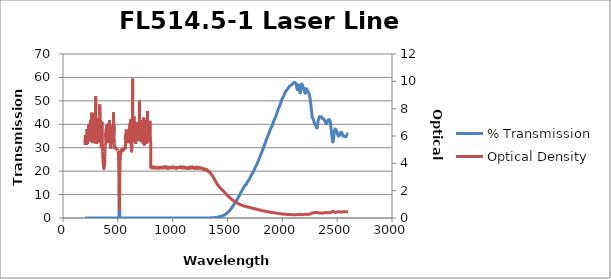
| Category | % Transmission |
|---|---|
| 2600.0 | 36.091 |
| 2599.0 | 36.079 |
| 2598.0 | 36.048 |
| 2597.0 | 36.021 |
| 2596.0 | 35.989 |
| 2595.0 | 35.951 |
| 2594.0 | 35.898 |
| 2593.0 | 35.84 |
| 2592.0 | 35.777 |
| 2591.0 | 35.707 |
| 2590.0 | 35.623 |
| 2589.0 | 35.537 |
| 2588.0 | 35.45 |
| 2587.0 | 35.343 |
| 2586.0 | 35.245 |
| 2585.0 | 35.151 |
| 2584.0 | 35.06 |
| 2583.0 | 34.962 |
| 2582.0 | 34.872 |
| 2581.0 | 34.804 |
| 2580.0 | 34.757 |
| 2579.0 | 34.724 |
| 2578.0 | 34.706 |
| 2577.0 | 34.711 |
| 2576.0 | 34.719 |
| 2575.0 | 34.741 |
| 2574.0 | 34.766 |
| 2573.0 | 34.79 |
| 2572.0 | 34.81 |
| 2571.0 | 34.83 |
| 2570.0 | 34.859 |
| 2569.0 | 34.868 |
| 2568.0 | 34.877 |
| 2567.0 | 34.877 |
| 2566.0 | 34.877 |
| 2565.0 | 34.872 |
| 2564.0 | 34.865 |
| 2563.0 | 34.86 |
| 2562.0 | 34.849 |
| 2561.0 | 34.852 |
| 2560.0 | 34.862 |
| 2559.0 | 34.874 |
| 2558.0 | 34.892 |
| 2557.0 | 34.929 |
| 2556.0 | 34.962 |
| 2555.0 | 35.015 |
| 2554.0 | 35.087 |
| 2553.0 | 35.17 |
| 2552.0 | 35.279 |
| 2551.0 | 35.398 |
| 2550.0 | 35.527 |
| 2549.0 | 35.647 |
| 2548.0 | 35.785 |
| 2547.0 | 35.908 |
| 2546.0 | 36.027 |
| 2545.0 | 36.131 |
| 2544.0 | 36.241 |
| 2543.0 | 36.333 |
| 2542.0 | 36.409 |
| 2541.0 | 36.477 |
| 2540.0 | 36.534 |
| 2539.0 | 36.573 |
| 2538.0 | 36.598 |
| 2537.0 | 36.615 |
| 2536.0 | 36.607 |
| 2535.0 | 36.579 |
| 2534.0 | 36.534 |
| 2533.0 | 36.465 |
| 2532.0 | 36.389 |
| 2531.0 | 36.3 |
| 2530.0 | 36.211 |
| 2529.0 | 36.112 |
| 2528.0 | 36.014 |
| 2527.0 | 35.909 |
| 2526.0 | 35.806 |
| 2525.0 | 35.697 |
| 2524.0 | 35.588 |
| 2523.0 | 35.485 |
| 2522.0 | 35.38 |
| 2521.0 | 35.276 |
| 2520.0 | 35.186 |
| 2519.0 | 35.105 |
| 2518.0 | 35.038 |
| 2517.0 | 34.98 |
| 2516.0 | 34.938 |
| 2515.0 | 34.918 |
| 2514.0 | 34.913 |
| 2513.0 | 34.931 |
| 2512.0 | 34.965 |
| 2511.0 | 35.035 |
| 2510.0 | 35.107 |
| 2509.0 | 35.21 |
| 2508.0 | 35.31 |
| 2507.0 | 35.444 |
| 2506.0 | 35.559 |
| 2505.0 | 35.707 |
| 2504.0 | 35.849 |
| 2503.0 | 36.005 |
| 2502.0 | 36.158 |
| 2501.0 | 36.313 |
| 2500.0 | 36.443 |
| 2499.0 | 36.578 |
| 2498.0 | 36.703 |
| 2497.0 | 36.817 |
| 2496.0 | 36.941 |
| 2495.0 | 37.043 |
| 2494.0 | 37.14 |
| 2493.0 | 37.218 |
| 2492.0 | 37.312 |
| 2491.0 | 37.381 |
| 2490.0 | 37.481 |
| 2489.0 | 37.564 |
| 2488.0 | 37.668 |
| 2487.0 | 37.744 |
| 2486.0 | 37.837 |
| 2485.0 | 37.895 |
| 2484.0 | 37.964 |
| 2483.0 | 37.991 |
| 2482.0 | 38.01 |
| 2481.0 | 37.971 |
| 2480.0 | 37.9 |
| 2479.0 | 37.768 |
| 2478.0 | 37.606 |
| 2477.0 | 37.393 |
| 2476.0 | 37.152 |
| 2475.0 | 36.886 |
| 2474.0 | 36.596 |
| 2473.0 | 36.276 |
| 2472.0 | 35.916 |
| 2471.0 | 35.552 |
| 2470.0 | 35.146 |
| 2469.0 | 34.742 |
| 2468.0 | 34.334 |
| 2467.0 | 33.932 |
| 2466.0 | 33.528 |
| 2465.0 | 33.167 |
| 2464.0 | 32.846 |
| 2463.0 | 32.61 |
| 2462.0 | 32.454 |
| 2461.0 | 32.417 |
| 2460.0 | 32.459 |
| 2459.0 | 32.606 |
| 2458.0 | 32.813 |
| 2457.0 | 33.111 |
| 2456.0 | 33.435 |
| 2455.0 | 33.795 |
| 2454.0 | 34.15 |
| 2453.0 | 34.538 |
| 2452.0 | 34.908 |
| 2451.0 | 35.316 |
| 2450.0 | 35.735 |
| 2449.0 | 36.171 |
| 2448.0 | 36.601 |
| 2447.0 | 37.065 |
| 2446.0 | 37.528 |
| 2445.0 | 37.983 |
| 2444.0 | 38.453 |
| 2443.0 | 38.918 |
| 2442.0 | 39.324 |
| 2441.0 | 39.74 |
| 2440.0 | 40.087 |
| 2439.0 | 40.405 |
| 2438.0 | 40.683 |
| 2437.0 | 40.929 |
| 2436.0 | 41.141 |
| 2435.0 | 41.329 |
| 2434.0 | 41.485 |
| 2433.0 | 41.613 |
| 2432.0 | 41.71 |
| 2431.0 | 41.797 |
| 2430.0 | 41.868 |
| 2429.0 | 41.919 |
| 2428.0 | 41.97 |
| 2427.0 | 42.006 |
| 2426.0 | 42.016 |
| 2425.0 | 42.021 |
| 2424.0 | 42.012 |
| 2423.0 | 41.988 |
| 2422.0 | 41.972 |
| 2421.0 | 41.943 |
| 2420.0 | 41.904 |
| 2419.0 | 41.867 |
| 2418.0 | 41.816 |
| 2417.0 | 41.762 |
| 2416.0 | 41.711 |
| 2415.0 | 41.638 |
| 2414.0 | 41.557 |
| 2413.0 | 41.453 |
| 2412.0 | 41.32 |
| 2411.0 | 41.185 |
| 2410.0 | 41.03 |
| 2409.0 | 40.877 |
| 2408.0 | 40.726 |
| 2407.0 | 40.561 |
| 2406.0 | 40.422 |
| 2405.0 | 40.295 |
| 2404.0 | 40.21 |
| 2403.0 | 40.172 |
| 2402.0 | 40.163 |
| 2401.0 | 40.191 |
| 2400.0 | 40.245 |
| 2399.0 | 40.315 |
| 2398.0 | 40.412 |
| 2397.0 | 40.516 |
| 2396.0 | 40.627 |
| 2395.0 | 40.742 |
| 2394.0 | 40.836 |
| 2393.0 | 40.927 |
| 2392.0 | 41.01 |
| 2391.0 | 41.091 |
| 2390.0 | 41.18 |
| 2389.0 | 41.274 |
| 2388.0 | 41.371 |
| 2387.0 | 41.47 |
| 2386.0 | 41.568 |
| 2385.0 | 41.671 |
| 2384.0 | 41.78 |
| 2383.0 | 41.88 |
| 2382.0 | 41.986 |
| 2381.0 | 42.065 |
| 2380.0 | 42.14 |
| 2379.0 | 42.179 |
| 2378.0 | 42.216 |
| 2377.0 | 42.239 |
| 2376.0 | 42.26 |
| 2375.0 | 42.256 |
| 2374.0 | 42.267 |
| 2373.0 | 42.26 |
| 2372.0 | 42.273 |
| 2371.0 | 42.292 |
| 2370.0 | 42.325 |
| 2369.0 | 42.355 |
| 2368.0 | 42.387 |
| 2367.0 | 42.423 |
| 2366.0 | 42.463 |
| 2365.0 | 42.515 |
| 2364.0 | 42.586 |
| 2363.0 | 42.676 |
| 2362.0 | 42.759 |
| 2361.0 | 42.865 |
| 2360.0 | 42.955 |
| 2359.0 | 43.054 |
| 2358.0 | 43.118 |
| 2357.0 | 43.179 |
| 2356.0 | 43.194 |
| 2355.0 | 43.185 |
| 2354.0 | 43.148 |
| 2353.0 | 43.115 |
| 2352.0 | 43.083 |
| 2351.0 | 43.065 |
| 2350.0 | 43.061 |
| 2349.0 | 43.061 |
| 2348.0 | 43.083 |
| 2347.0 | 43.108 |
| 2346.0 | 43.162 |
| 2345.0 | 43.199 |
| 2344.0 | 43.254 |
| 2343.0 | 43.274 |
| 2342.0 | 43.3 |
| 2341.0 | 43.302 |
| 2340.0 | 43.298 |
| 2339.0 | 43.269 |
| 2338.0 | 43.233 |
| 2337.0 | 43.164 |
| 2336.0 | 43.056 |
| 2335.0 | 42.937 |
| 2334.0 | 42.787 |
| 2333.0 | 42.63 |
| 2332.0 | 42.464 |
| 2331.0 | 42.284 |
| 2330.0 | 42.091 |
| 2329.0 | 41.901 |
| 2328.0 | 41.706 |
| 2327.0 | 41.502 |
| 2326.0 | 41.304 |
| 2325.0 | 41.069 |
| 2324.0 | 40.822 |
| 2323.0 | 40.53 |
| 2322.0 | 40.216 |
| 2321.0 | 39.869 |
| 2320.0 | 39.519 |
| 2319.0 | 39.188 |
| 2318.0 | 38.885 |
| 2317.0 | 38.649 |
| 2316.0 | 38.492 |
| 2315.0 | 38.417 |
| 2314.0 | 38.424 |
| 2313.0 | 38.493 |
| 2312.0 | 38.615 |
| 2311.0 | 38.76 |
| 2310.0 | 38.921 |
| 2309.0 | 39.086 |
| 2308.0 | 39.223 |
| 2307.0 | 39.33 |
| 2306.0 | 39.399 |
| 2305.0 | 39.437 |
| 2304.0 | 39.466 |
| 2303.0 | 39.474 |
| 2302.0 | 39.503 |
| 2301.0 | 39.528 |
| 2300.0 | 39.575 |
| 2299.0 | 39.643 |
| 2298.0 | 39.73 |
| 2297.0 | 39.842 |
| 2296.0 | 39.966 |
| 2295.0 | 40.107 |
| 2294.0 | 40.239 |
| 2293.0 | 40.381 |
| 2292.0 | 40.527 |
| 2291.0 | 40.676 |
| 2290.0 | 40.829 |
| 2289.0 | 40.997 |
| 2288.0 | 41.159 |
| 2287.0 | 41.332 |
| 2286.0 | 41.512 |
| 2285.0 | 41.701 |
| 2284.0 | 41.875 |
| 2283.0 | 42.059 |
| 2282.0 | 42.215 |
| 2281.0 | 42.345 |
| 2280.0 | 42.449 |
| 2279.0 | 42.53 |
| 2278.0 | 42.585 |
| 2277.0 | 42.637 |
| 2276.0 | 42.693 |
| 2275.0 | 42.764 |
| 2274.0 | 42.877 |
| 2273.0 | 43.035 |
| 2272.0 | 43.256 |
| 2271.0 | 43.534 |
| 2270.0 | 43.887 |
| 2269.0 | 44.289 |
| 2268.0 | 44.718 |
| 2267.0 | 45.177 |
| 2266.0 | 45.638 |
| 2265.0 | 46.106 |
| 2264.0 | 46.583 |
| 2263.0 | 47.058 |
| 2262.0 | 47.505 |
| 2261.0 | 47.934 |
| 2260.0 | 48.348 |
| 2259.0 | 48.748 |
| 2258.0 | 49.131 |
| 2257.0 | 49.519 |
| 2256.0 | 49.892 |
| 2255.0 | 50.237 |
| 2254.0 | 50.582 |
| 2253.0 | 50.913 |
| 2252.0 | 51.219 |
| 2251.0 | 51.524 |
| 2250.0 | 51.81 |
| 2249.0 | 52.063 |
| 2248.0 | 52.303 |
| 2247.0 | 52.523 |
| 2246.0 | 52.723 |
| 2245.0 | 52.898 |
| 2244.0 | 53.063 |
| 2243.0 | 53.199 |
| 2242.0 | 53.315 |
| 2241.0 | 53.422 |
| 2240.0 | 53.502 |
| 2239.0 | 53.577 |
| 2238.0 | 53.64 |
| 2237.0 | 53.698 |
| 2236.0 | 53.742 |
| 2235.0 | 53.798 |
| 2234.0 | 53.856 |
| 2233.0 | 53.924 |
| 2232.0 | 54.011 |
| 2231.0 | 54.115 |
| 2230.0 | 54.234 |
| 2229.0 | 54.363 |
| 2228.0 | 54.511 |
| 2227.0 | 54.658 |
| 2226.0 | 54.802 |
| 2225.0 | 54.93 |
| 2224.0 | 55.044 |
| 2223.0 | 55.128 |
| 2222.0 | 55.176 |
| 2221.0 | 55.194 |
| 2220.0 | 55.166 |
| 2219.0 | 55.093 |
| 2218.0 | 54.97 |
| 2217.0 | 54.815 |
| 2216.0 | 54.624 |
| 2215.0 | 54.401 |
| 2214.0 | 54.164 |
| 2213.0 | 53.927 |
| 2212.0 | 53.7 |
| 2211.0 | 53.5 |
| 2210.0 | 53.351 |
| 2209.0 | 53.248 |
| 2208.0 | 53.196 |
| 2207.0 | 53.215 |
| 2206.0 | 53.288 |
| 2205.0 | 53.41 |
| 2204.0 | 53.585 |
| 2203.0 | 53.786 |
| 2202.0 | 54.01 |
| 2201.0 | 54.25 |
| 2200.0 | 54.483 |
| 2199.0 | 54.725 |
| 2198.0 | 54.937 |
| 2197.0 | 55.119 |
| 2196.0 | 55.278 |
| 2195.0 | 55.421 |
| 2194.0 | 55.525 |
| 2193.0 | 55.619 |
| 2192.0 | 55.7 |
| 2191.0 | 55.774 |
| 2190.0 | 55.859 |
| 2189.0 | 55.949 |
| 2188.0 | 56.062 |
| 2187.0 | 56.19 |
| 2186.0 | 56.331 |
| 2185.0 | 56.493 |
| 2184.0 | 56.641 |
| 2183.0 | 56.79 |
| 2182.0 | 56.924 |
| 2181.0 | 57.031 |
| 2180.0 | 57.125 |
| 2179.0 | 57.19 |
| 2178.0 | 57.221 |
| 2177.0 | 57.214 |
| 2176.0 | 57.158 |
| 2175.0 | 57.065 |
| 2174.0 | 56.913 |
| 2173.0 | 56.692 |
| 2172.0 | 56.413 |
| 2171.0 | 56.07 |
| 2170.0 | 55.672 |
| 2169.0 | 55.222 |
| 2168.0 | 54.783 |
| 2167.0 | 54.336 |
| 2166.0 | 53.944 |
| 2165.0 | 53.657 |
| 2164.0 | 53.461 |
| 2163.0 | 53.39 |
| 2162.0 | 53.429 |
| 2161.0 | 53.594 |
| 2160.0 | 53.838 |
| 2159.0 | 54.149 |
| 2158.0 | 54.497 |
| 2157.0 | 54.869 |
| 2156.0 | 55.235 |
| 2155.0 | 55.586 |
| 2154.0 | 55.912 |
| 2153.0 | 56.185 |
| 2152.0 | 56.406 |
| 2151.0 | 56.579 |
| 2150.0 | 56.701 |
| 2149.0 | 56.767 |
| 2148.0 | 56.779 |
| 2147.0 | 56.745 |
| 2146.0 | 56.653 |
| 2145.0 | 56.519 |
| 2144.0 | 56.347 |
| 2143.0 | 56.13 |
| 2142.0 | 55.902 |
| 2141.0 | 55.641 |
| 2140.0 | 55.391 |
| 2139.0 | 55.172 |
| 2138.0 | 54.985 |
| 2137.0 | 54.864 |
| 2136.0 | 54.811 |
| 2135.0 | 54.872 |
| 2134.0 | 55.01 |
| 2133.0 | 55.235 |
| 2132.0 | 55.513 |
| 2131.0 | 55.845 |
| 2130.0 | 56.17 |
| 2129.0 | 56.489 |
| 2128.0 | 56.783 |
| 2127.0 | 57.019 |
| 2126.0 | 57.202 |
| 2125.0 | 57.342 |
| 2124.0 | 57.447 |
| 2123.0 | 57.52 |
| 2122.0 | 57.574 |
| 2121.0 | 57.618 |
| 2120.0 | 57.65 |
| 2119.0 | 57.694 |
| 2118.0 | 57.725 |
| 2117.0 | 57.752 |
| 2116.0 | 57.785 |
| 2115.0 | 57.805 |
| 2114.0 | 57.821 |
| 2113.0 | 57.826 |
| 2112.0 | 57.825 |
| 2111.0 | 57.823 |
| 2110.0 | 57.812 |
| 2109.0 | 57.809 |
| 2108.0 | 57.798 |
| 2107.0 | 57.781 |
| 2106.0 | 57.765 |
| 2105.0 | 57.746 |
| 2104.0 | 57.716 |
| 2103.0 | 57.685 |
| 2102.0 | 57.652 |
| 2101.0 | 57.613 |
| 2100.0 | 57.566 |
| 2099.0 | 57.524 |
| 2098.0 | 57.477 |
| 2097.0 | 57.432 |
| 2096.0 | 57.381 |
| 2095.0 | 57.331 |
| 2094.0 | 57.284 |
| 2093.0 | 57.235 |
| 2092.0 | 57.182 |
| 2091.0 | 57.136 |
| 2090.0 | 57.089 |
| 2089.0 | 57.041 |
| 2088.0 | 56.995 |
| 2087.0 | 56.958 |
| 2086.0 | 56.911 |
| 2085.0 | 56.88 |
| 2084.0 | 56.836 |
| 2083.0 | 56.794 |
| 2082.0 | 56.766 |
| 2081.0 | 56.73 |
| 2080.0 | 56.702 |
| 2079.0 | 56.672 |
| 2078.0 | 56.647 |
| 2077.0 | 56.617 |
| 2076.0 | 56.587 |
| 2075.0 | 56.559 |
| 2074.0 | 56.526 |
| 2073.0 | 56.498 |
| 2072.0 | 56.461 |
| 2071.0 | 56.432 |
| 2070.0 | 56.393 |
| 2069.0 | 56.352 |
| 2068.0 | 56.316 |
| 2067.0 | 56.261 |
| 2066.0 | 56.216 |
| 2065.0 | 56.164 |
| 2064.0 | 56.103 |
| 2063.0 | 56.051 |
| 2062.0 | 55.994 |
| 2061.0 | 55.927 |
| 2060.0 | 55.865 |
| 2059.0 | 55.798 |
| 2058.0 | 55.728 |
| 2057.0 | 55.658 |
| 2056.0 | 55.591 |
| 2055.0 | 55.517 |
| 2054.0 | 55.451 |
| 2053.0 | 55.377 |
| 2052.0 | 55.312 |
| 2051.0 | 55.245 |
| 2050.0 | 55.175 |
| 2049.0 | 55.121 |
| 2048.0 | 55.059 |
| 2047.0 | 54.993 |
| 2046.0 | 54.937 |
| 2045.0 | 54.875 |
| 2044.0 | 54.815 |
| 2043.0 | 54.763 |
| 2042.0 | 54.706 |
| 2041.0 | 54.646 |
| 2040.0 | 54.587 |
| 2039.0 | 54.535 |
| 2038.0 | 54.478 |
| 2037.0 | 54.426 |
| 2036.0 | 54.365 |
| 2035.0 | 54.297 |
| 2034.0 | 54.231 |
| 2033.0 | 54.169 |
| 2032.0 | 54.091 |
| 2031.0 | 54.007 |
| 2030.0 | 53.92 |
| 2029.0 | 53.833 |
| 2028.0 | 53.739 |
| 2027.0 | 53.637 |
| 2026.0 | 53.548 |
| 2025.0 | 53.44 |
| 2024.0 | 53.335 |
| 2023.0 | 53.234 |
| 2022.0 | 53.132 |
| 2021.0 | 53.021 |
| 2020.0 | 52.914 |
| 2019.0 | 52.803 |
| 2018.0 | 52.698 |
| 2017.0 | 52.593 |
| 2016.0 | 52.487 |
| 2015.0 | 52.388 |
| 2014.0 | 52.289 |
| 2013.0 | 52.182 |
| 2012.0 | 52.09 |
| 2011.0 | 51.996 |
| 2010.0 | 51.9 |
| 2009.0 | 51.814 |
| 2008.0 | 51.726 |
| 2007.0 | 51.647 |
| 2006.0 | 51.559 |
| 2005.0 | 51.465 |
| 2004.0 | 51.392 |
| 2003.0 | 51.299 |
| 2002.0 | 51.211 |
| 2001.0 | 51.118 |
| 2000.0 | 51.027 |
| 1999.0 | 50.921 |
| 1998.0 | 50.821 |
| 1997.0 | 50.716 |
| 1996.0 | 50.604 |
| 1995.0 | 50.491 |
| 1994.0 | 50.37 |
| 1993.0 | 50.24 |
| 1992.0 | 50.116 |
| 1991.0 | 49.986 |
| 1990.0 | 49.853 |
| 1989.0 | 49.716 |
| 1988.0 | 49.574 |
| 1987.0 | 49.432 |
| 1986.0 | 49.279 |
| 1985.0 | 49.141 |
| 1984.0 | 48.994 |
| 1983.0 | 48.846 |
| 1982.0 | 48.709 |
| 1981.0 | 48.572 |
| 1980.0 | 48.432 |
| 1979.0 | 48.292 |
| 1978.0 | 48.157 |
| 1977.0 | 48.041 |
| 1976.0 | 47.915 |
| 1975.0 | 47.791 |
| 1974.0 | 47.671 |
| 1973.0 | 47.555 |
| 1972.0 | 47.453 |
| 1971.0 | 47.339 |
| 1970.0 | 47.234 |
| 1969.0 | 47.139 |
| 1968.0 | 47.035 |
| 1967.0 | 46.921 |
| 1966.0 | 46.812 |
| 1965.0 | 46.705 |
| 1964.0 | 46.604 |
| 1963.0 | 46.487 |
| 1962.0 | 46.372 |
| 1961.0 | 46.241 |
| 1960.0 | 46.119 |
| 1959.0 | 46.002 |
| 1958.0 | 45.867 |
| 1957.0 | 45.728 |
| 1956.0 | 45.594 |
| 1955.0 | 45.452 |
| 1954.0 | 45.304 |
| 1953.0 | 45.147 |
| 1952.0 | 45.002 |
| 1951.0 | 44.858 |
| 1950.0 | 44.711 |
| 1949.0 | 44.555 |
| 1948.0 | 44.405 |
| 1947.0 | 44.265 |
| 1946.0 | 44.126 |
| 1945.0 | 43.986 |
| 1944.0 | 43.843 |
| 1943.0 | 43.721 |
| 1942.0 | 43.592 |
| 1941.0 | 43.468 |
| 1940.0 | 43.347 |
| 1939.0 | 43.229 |
| 1938.0 | 43.125 |
| 1937.0 | 43.02 |
| 1936.0 | 42.914 |
| 1935.0 | 42.811 |
| 1934.0 | 42.71 |
| 1933.0 | 42.621 |
| 1932.0 | 42.52 |
| 1931.0 | 42.413 |
| 1930.0 | 42.307 |
| 1929.0 | 42.198 |
| 1928.0 | 42.087 |
| 1927.0 | 41.97 |
| 1926.0 | 41.857 |
| 1925.0 | 41.741 |
| 1924.0 | 41.631 |
| 1923.0 | 41.506 |
| 1922.0 | 41.381 |
| 1921.0 | 41.243 |
| 1920.0 | 41.098 |
| 1919.0 | 40.951 |
| 1918.0 | 40.823 |
| 1917.0 | 40.7 |
| 1916.0 | 40.566 |
| 1915.0 | 40.414 |
| 1914.0 | 40.289 |
| 1913.0 | 40.143 |
| 1912.0 | 40.019 |
| 1911.0 | 39.882 |
| 1910.0 | 39.755 |
| 1909.0 | 39.645 |
| 1908.0 | 39.551 |
| 1907.0 | 39.454 |
| 1906.0 | 39.342 |
| 1905.0 | 39.231 |
| 1904.0 | 39.128 |
| 1903.0 | 39.034 |
| 1902.0 | 38.951 |
| 1901.0 | 38.863 |
| 1900.0 | 38.773 |
| 1899.0 | 38.67 |
| 1898.0 | 38.574 |
| 1897.0 | 38.48 |
| 1896.0 | 38.394 |
| 1895.0 | 38.305 |
| 1894.0 | 38.201 |
| 1893.0 | 38.097 |
| 1892.0 | 37.995 |
| 1891.0 | 37.879 |
| 1890.0 | 37.744 |
| 1889.0 | 37.62 |
| 1888.0 | 37.504 |
| 1887.0 | 37.392 |
| 1886.0 | 37.266 |
| 1885.0 | 37.135 |
| 1884.0 | 36.986 |
| 1883.0 | 36.846 |
| 1882.0 | 36.712 |
| 1881.0 | 36.593 |
| 1880.0 | 36.46 |
| 1879.0 | 36.334 |
| 1878.0 | 36.2 |
| 1877.0 | 36.064 |
| 1876.0 | 35.949 |
| 1875.0 | 35.838 |
| 1874.0 | 35.725 |
| 1873.0 | 35.614 |
| 1872.0 | 35.49 |
| 1871.0 | 35.362 |
| 1870.0 | 35.255 |
| 1869.0 | 35.156 |
| 1868.0 | 35.051 |
| 1867.0 | 34.944 |
| 1866.0 | 34.842 |
| 1865.0 | 34.729 |
| 1864.0 | 34.626 |
| 1863.0 | 34.514 |
| 1862.0 | 34.413 |
| 1861.0 | 34.307 |
| 1860.0 | 34.187 |
| 1859.0 | 34.051 |
| 1858.0 | 33.911 |
| 1857.0 | 33.783 |
| 1856.0 | 33.651 |
| 1855.0 | 33.525 |
| 1854.0 | 33.395 |
| 1853.0 | 33.254 |
| 1852.0 | 33.104 |
| 1851.0 | 32.961 |
| 1850.0 | 32.841 |
| 1849.0 | 32.709 |
| 1848.0 | 32.571 |
| 1847.0 | 32.417 |
| 1846.0 | 32.259 |
| 1845.0 | 32.134 |
| 1844.0 | 32.013 |
| 1843.0 | 31.9 |
| 1842.0 | 31.771 |
| 1841.0 | 31.64 |
| 1840.0 | 31.52 |
| 1839.0 | 31.413 |
| 1838.0 | 31.294 |
| 1837.0 | 31.179 |
| 1836.0 | 31.049 |
| 1835.0 | 30.916 |
| 1834.0 | 30.794 |
| 1833.0 | 30.68 |
| 1832.0 | 30.567 |
| 1831.0 | 30.45 |
| 1830.0 | 30.327 |
| 1829.0 | 30.196 |
| 1828.0 | 30.087 |
| 1827.0 | 29.964 |
| 1826.0 | 29.838 |
| 1825.0 | 29.703 |
| 1824.0 | 29.579 |
| 1823.0 | 29.464 |
| 1822.0 | 29.339 |
| 1821.0 | 29.212 |
| 1820.0 | 29.064 |
| 1819.0 | 28.931 |
| 1818.0 | 28.801 |
| 1817.0 | 28.681 |
| 1816.0 | 28.545 |
| 1815.0 | 28.408 |
| 1814.0 | 28.286 |
| 1813.0 | 28.157 |
| 1812.0 | 28.042 |
| 1811.0 | 27.908 |
| 1810.0 | 27.792 |
| 1809.0 | 27.682 |
| 1808.0 | 27.572 |
| 1807.0 | 27.458 |
| 1806.0 | 27.341 |
| 1805.0 | 27.242 |
| 1804.0 | 27.123 |
| 1803.0 | 27.023 |
| 1802.0 | 26.91 |
| 1801.0 | 26.801 |
| 1800.0 | 26.682 |
| 1799.0 | 26.575 |
| 1798.0 | 26.469 |
| 1797.0 | 26.352 |
| 1796.0 | 26.243 |
| 1795.0 | 26.122 |
| 1794.0 | 25.998 |
| 1793.0 | 25.876 |
| 1792.0 | 25.758 |
| 1791.0 | 25.635 |
| 1790.0 | 25.508 |
| 1789.0 | 25.384 |
| 1788.0 | 25.259 |
| 1787.0 | 25.131 |
| 1786.0 | 25.006 |
| 1785.0 | 24.881 |
| 1784.0 | 24.769 |
| 1783.0 | 24.641 |
| 1782.0 | 24.523 |
| 1781.0 | 24.401 |
| 1780.0 | 24.285 |
| 1779.0 | 24.171 |
| 1778.0 | 24.046 |
| 1777.0 | 23.933 |
| 1776.0 | 23.814 |
| 1775.0 | 23.695 |
| 1774.0 | 23.582 |
| 1773.0 | 23.466 |
| 1772.0 | 23.356 |
| 1771.0 | 23.247 |
| 1770.0 | 23.149 |
| 1769.0 | 23.044 |
| 1768.0 | 22.945 |
| 1767.0 | 22.856 |
| 1766.0 | 22.77 |
| 1765.0 | 22.679 |
| 1764.0 | 22.588 |
| 1763.0 | 22.503 |
| 1762.0 | 22.408 |
| 1761.0 | 22.317 |
| 1760.0 | 22.229 |
| 1759.0 | 22.137 |
| 1758.0 | 22.042 |
| 1757.0 | 21.95 |
| 1756.0 | 21.855 |
| 1755.0 | 21.753 |
| 1754.0 | 21.656 |
| 1753.0 | 21.553 |
| 1752.0 | 21.45 |
| 1751.0 | 21.357 |
| 1750.0 | 21.251 |
| 1749.0 | 21.147 |
| 1748.0 | 21.046 |
| 1747.0 | 20.943 |
| 1746.0 | 20.836 |
| 1745.0 | 20.723 |
| 1744.0 | 20.613 |
| 1743.0 | 20.495 |
| 1742.0 | 20.376 |
| 1741.0 | 20.268 |
| 1740.0 | 20.158 |
| 1739.0 | 20.055 |
| 1738.0 | 19.959 |
| 1737.0 | 19.858 |
| 1736.0 | 19.764 |
| 1735.0 | 19.68 |
| 1734.0 | 19.59 |
| 1733.0 | 19.511 |
| 1732.0 | 19.43 |
| 1731.0 | 19.353 |
| 1730.0 | 19.277 |
| 1729.0 | 19.2 |
| 1728.0 | 19.124 |
| 1727.0 | 19.037 |
| 1726.0 | 18.953 |
| 1725.0 | 18.868 |
| 1724.0 | 18.777 |
| 1723.0 | 18.687 |
| 1722.0 | 18.61 |
| 1721.0 | 18.53 |
| 1720.0 | 18.457 |
| 1719.0 | 18.384 |
| 1718.0 | 18.317 |
| 1717.0 | 18.243 |
| 1716.0 | 18.173 |
| 1715.0 | 18.105 |
| 1714.0 | 18.025 |
| 1713.0 | 17.944 |
| 1712.0 | 17.858 |
| 1711.0 | 17.763 |
| 1710.0 | 17.661 |
| 1709.0 | 17.565 |
| 1708.0 | 17.457 |
| 1707.0 | 17.348 |
| 1706.0 | 17.242 |
| 1705.0 | 17.116 |
| 1704.0 | 16.997 |
| 1703.0 | 16.878 |
| 1702.0 | 16.758 |
| 1701.0 | 16.648 |
| 1700.0 | 16.547 |
| 1699.0 | 16.467 |
| 1698.0 | 16.399 |
| 1697.0 | 16.346 |
| 1696.0 | 16.298 |
| 1695.0 | 16.244 |
| 1694.0 | 16.189 |
| 1693.0 | 16.118 |
| 1692.0 | 16.034 |
| 1691.0 | 15.945 |
| 1690.0 | 15.863 |
| 1689.0 | 15.784 |
| 1688.0 | 15.717 |
| 1687.0 | 15.663 |
| 1686.0 | 15.619 |
| 1685.0 | 15.583 |
| 1684.0 | 15.55 |
| 1683.0 | 15.512 |
| 1682.0 | 15.47 |
| 1681.0 | 15.417 |
| 1680.0 | 15.346 |
| 1679.0 | 15.262 |
| 1678.0 | 15.16 |
| 1677.0 | 15.053 |
| 1676.0 | 14.934 |
| 1675.0 | 14.816 |
| 1674.0 | 14.695 |
| 1673.0 | 14.577 |
| 1672.0 | 14.466 |
| 1671.0 | 14.368 |
| 1670.0 | 14.289 |
| 1669.0 | 14.214 |
| 1668.0 | 14.163 |
| 1667.0 | 14.127 |
| 1666.0 | 14.103 |
| 1665.0 | 14.087 |
| 1664.0 | 14.076 |
| 1663.0 | 14.063 |
| 1662.0 | 14.041 |
| 1661.0 | 14.012 |
| 1660.0 | 13.972 |
| 1659.0 | 13.925 |
| 1658.0 | 13.871 |
| 1657.0 | 13.805 |
| 1656.0 | 13.737 |
| 1655.0 | 13.662 |
| 1654.0 | 13.584 |
| 1653.0 | 13.496 |
| 1652.0 | 13.407 |
| 1651.0 | 13.32 |
| 1650.0 | 13.226 |
| 1649.0 | 13.135 |
| 1648.0 | 13.05 |
| 1647.0 | 12.966 |
| 1646.0 | 12.888 |
| 1645.0 | 12.815 |
| 1644.0 | 12.742 |
| 1643.0 | 12.668 |
| 1642.0 | 12.598 |
| 1641.0 | 12.514 |
| 1640.0 | 12.435 |
| 1639.0 | 12.351 |
| 1638.0 | 12.268 |
| 1637.0 | 12.179 |
| 1636.0 | 12.092 |
| 1635.0 | 12.006 |
| 1634.0 | 11.916 |
| 1633.0 | 11.831 |
| 1632.0 | 11.751 |
| 1631.0 | 11.665 |
| 1630.0 | 11.583 |
| 1629.0 | 11.508 |
| 1628.0 | 11.417 |
| 1627.0 | 11.336 |
| 1626.0 | 11.252 |
| 1625.0 | 11.164 |
| 1624.0 | 11.078 |
| 1623.0 | 10.989 |
| 1622.0 | 10.898 |
| 1621.0 | 10.803 |
| 1620.0 | 10.709 |
| 1619.0 | 10.616 |
| 1618.0 | 10.525 |
| 1617.0 | 10.432 |
| 1616.0 | 10.341 |
| 1615.0 | 10.246 |
| 1614.0 | 10.152 |
| 1613.0 | 10.061 |
| 1612.0 | 9.971 |
| 1611.0 | 9.881 |
| 1610.0 | 9.793 |
| 1609.0 | 9.7 |
| 1608.0 | 9.615 |
| 1607.0 | 9.526 |
| 1606.0 | 9.447 |
| 1605.0 | 9.362 |
| 1604.0 | 9.283 |
| 1603.0 | 9.2 |
| 1602.0 | 9.117 |
| 1601.0 | 9.037 |
| 1600.0 | 8.956 |
| 1599.0 | 8.871 |
| 1598.0 | 8.788 |
| 1597.0 | 8.705 |
| 1596.0 | 8.62 |
| 1595.0 | 8.531 |
| 1594.0 | 8.445 |
| 1593.0 | 8.36 |
| 1592.0 | 8.275 |
| 1591.0 | 8.188 |
| 1590.0 | 8.102 |
| 1589.0 | 8.015 |
| 1588.0 | 7.931 |
| 1587.0 | 7.853 |
| 1586.0 | 7.774 |
| 1585.0 | 7.692 |
| 1584.0 | 7.618 |
| 1583.0 | 7.539 |
| 1582.0 | 7.462 |
| 1581.0 | 7.389 |
| 1580.0 | 7.318 |
| 1579.0 | 7.243 |
| 1578.0 | 7.169 |
| 1577.0 | 7.096 |
| 1576.0 | 7.019 |
| 1575.0 | 6.944 |
| 1574.0 | 6.867 |
| 1573.0 | 6.792 |
| 1572.0 | 6.714 |
| 1571.0 | 6.637 |
| 1570.0 | 6.558 |
| 1569.0 | 6.48 |
| 1568.0 | 6.403 |
| 1567.0 | 6.329 |
| 1566.0 | 6.253 |
| 1565.0 | 6.179 |
| 1564.0 | 6.105 |
| 1563.0 | 6.03 |
| 1562.0 | 5.961 |
| 1561.0 | 5.89 |
| 1560.0 | 5.823 |
| 1559.0 | 5.754 |
| 1558.0 | 5.686 |
| 1557.0 | 5.615 |
| 1556.0 | 5.548 |
| 1555.0 | 5.478 |
| 1554.0 | 5.411 |
| 1553.0 | 5.339 |
| 1552.0 | 5.273 |
| 1551.0 | 5.199 |
| 1550.0 | 5.125 |
| 1549.0 | 5.061 |
| 1548.0 | 4.99 |
| 1547.0 | 4.918 |
| 1546.0 | 4.848 |
| 1545.0 | 4.773 |
| 1544.0 | 4.705 |
| 1543.0 | 4.635 |
| 1542.0 | 4.574 |
| 1541.0 | 4.505 |
| 1540.0 | 4.438 |
| 1539.0 | 4.375 |
| 1538.0 | 4.311 |
| 1537.0 | 4.247 |
| 1536.0 | 4.186 |
| 1535.0 | 4.125 |
| 1534.0 | 4.065 |
| 1533.0 | 4.007 |
| 1532.0 | 3.943 |
| 1531.0 | 3.882 |
| 1530.0 | 3.824 |
| 1529.0 | 3.758 |
| 1528.0 | 3.698 |
| 1527.0 | 3.639 |
| 1526.0 | 3.579 |
| 1525.0 | 3.517 |
| 1524.0 | 3.456 |
| 1523.0 | 3.4 |
| 1522.0 | 3.339 |
| 1521.0 | 3.282 |
| 1520.0 | 3.225 |
| 1519.0 | 3.169 |
| 1518.0 | 3.111 |
| 1517.0 | 3.061 |
| 1516.0 | 3.009 |
| 1515.0 | 2.958 |
| 1514.0 | 2.907 |
| 1513.0 | 2.855 |
| 1512.0 | 2.803 |
| 1511.0 | 2.756 |
| 1510.0 | 2.708 |
| 1509.0 | 2.659 |
| 1508.0 | 2.609 |
| 1507.0 | 2.56 |
| 1506.0 | 2.512 |
| 1505.0 | 2.464 |
| 1504.0 | 2.418 |
| 1503.0 | 2.372 |
| 1502.0 | 2.324 |
| 1501.0 | 2.28 |
| 1500.0 | 2.233 |
| 1499.0 | 2.193 |
| 1498.0 | 2.148 |
| 1497.0 | 2.108 |
| 1496.0 | 2.07 |
| 1495.0 | 2.032 |
| 1494.0 | 1.992 |
| 1493.0 | 1.958 |
| 1492.0 | 1.921 |
| 1491.0 | 1.886 |
| 1490.0 | 1.85 |
| 1489.0 | 1.815 |
| 1488.0 | 1.782 |
| 1487.0 | 1.746 |
| 1486.0 | 1.713 |
| 1485.0 | 1.679 |
| 1484.0 | 1.645 |
| 1483.0 | 1.612 |
| 1482.0 | 1.58 |
| 1481.0 | 1.548 |
| 1480.0 | 1.515 |
| 1479.0 | 1.487 |
| 1478.0 | 1.459 |
| 1477.0 | 1.434 |
| 1476.0 | 1.407 |
| 1475.0 | 1.378 |
| 1474.0 | 1.354 |
| 1473.0 | 1.329 |
| 1472.0 | 1.308 |
| 1471.0 | 1.283 |
| 1470.0 | 1.258 |
| 1469.0 | 1.235 |
| 1468.0 | 1.212 |
| 1467.0 | 1.19 |
| 1466.0 | 1.169 |
| 1465.0 | 1.147 |
| 1464.0 | 1.128 |
| 1463.0 | 1.104 |
| 1462.0 | 1.081 |
| 1461.0 | 1.06 |
| 1460.0 | 1.042 |
| 1459.0 | 1.023 |
| 1458.0 | 1.004 |
| 1457.0 | 0.984 |
| 1456.0 | 0.97 |
| 1455.0 | 0.951 |
| 1454.0 | 0.935 |
| 1453.0 | 0.917 |
| 1452.0 | 0.905 |
| 1451.0 | 0.886 |
| 1450.0 | 0.872 |
| 1449.0 | 0.852 |
| 1448.0 | 0.838 |
| 1447.0 | 0.822 |
| 1446.0 | 0.808 |
| 1445.0 | 0.79 |
| 1444.0 | 0.776 |
| 1443.0 | 0.761 |
| 1442.0 | 0.745 |
| 1441.0 | 0.731 |
| 1440.0 | 0.719 |
| 1439.0 | 0.706 |
| 1438.0 | 0.693 |
| 1437.0 | 0.679 |
| 1436.0 | 0.667 |
| 1435.0 | 0.654 |
| 1434.0 | 0.638 |
| 1433.0 | 0.631 |
| 1432.0 | 0.614 |
| 1431.0 | 0.603 |
| 1430.0 | 0.59 |
| 1429.0 | 0.58 |
| 1428.0 | 0.564 |
| 1427.0 | 0.553 |
| 1426.0 | 0.542 |
| 1425.0 | 0.534 |
| 1424.0 | 0.521 |
| 1423.0 | 0.506 |
| 1422.0 | 0.498 |
| 1421.0 | 0.485 |
| 1420.0 | 0.476 |
| 1419.0 | 0.466 |
| 1418.0 | 0.456 |
| 1417.0 | 0.446 |
| 1416.0 | 0.434 |
| 1415.0 | 0.425 |
| 1414.0 | 0.413 |
| 1413.0 | 0.404 |
| 1412.0 | 0.392 |
| 1411.0 | 0.379 |
| 1410.0 | 0.375 |
| 1409.0 | 0.362 |
| 1408.0 | 0.35 |
| 1407.0 | 0.342 |
| 1406.0 | 0.334 |
| 1405.0 | 0.323 |
| 1404.0 | 0.313 |
| 1403.0 | 0.302 |
| 1402.0 | 0.295 |
| 1401.0 | 0.29 |
| 1400.0 | 0.279 |
| 1399.0 | 0.268 |
| 1398.0 | 0.258 |
| 1397.0 | 0.253 |
| 1396.0 | 0.245 |
| 1395.0 | 0.236 |
| 1394.0 | 0.226 |
| 1393.0 | 0.218 |
| 1392.0 | 0.217 |
| 1391.0 | 0.203 |
| 1390.0 | 0.201 |
| 1389.0 | 0.193 |
| 1388.0 | 0.19 |
| 1387.0 | 0.178 |
| 1386.0 | 0.176 |
| 1385.0 | 0.169 |
| 1384.0 | 0.161 |
| 1383.0 | 0.161 |
| 1382.0 | 0.153 |
| 1381.0 | 0.149 |
| 1380.0 | 0.142 |
| 1379.0 | 0.137 |
| 1378.0 | 0.131 |
| 1377.0 | 0.131 |
| 1376.0 | 0.124 |
| 1375.0 | 0.122 |
| 1374.0 | 0.117 |
| 1373.0 | 0.113 |
| 1372.0 | 0.11 |
| 1371.0 | 0.108 |
| 1370.0 | 0.104 |
| 1369.0 | 0.098 |
| 1368.0 | 0.095 |
| 1367.0 | 0.091 |
| 1366.0 | 0.09 |
| 1365.0 | 0.092 |
| 1364.0 | 0.086 |
| 1363.0 | 0.082 |
| 1362.0 | 0.082 |
| 1361.0 | 0.077 |
| 1360.0 | 0.074 |
| 1359.0 | 0.074 |
| 1358.0 | 0.071 |
| 1357.0 | 0.069 |
| 1356.0 | 0.068 |
| 1355.0 | 0.067 |
| 1354.0 | 0.068 |
| 1353.0 | 0.063 |
| 1352.0 | 0.06 |
| 1351.0 | 0.06 |
| 1350.0 | 0.057 |
| 1349.0 | 0.056 |
| 1348.0 | 0.057 |
| 1347.0 | 0.054 |
| 1346.0 | 0.053 |
| 1345.0 | 0.054 |
| 1344.0 | 0.05 |
| 1343.0 | 0.049 |
| 1342.0 | 0.048 |
| 1341.0 | 0.048 |
| 1340.0 | 0.046 |
| 1339.0 | 0.048 |
| 1338.0 | 0.045 |
| 1337.0 | 0.043 |
| 1336.0 | 0.045 |
| 1335.0 | 0.046 |
| 1334.0 | 0.042 |
| 1333.0 | 0.044 |
| 1332.0 | 0.041 |
| 1331.0 | 0.041 |
| 1330.0 | 0.04 |
| 1329.0 | 0.039 |
| 1328.0 | 0.041 |
| 1327.0 | 0.036 |
| 1326.0 | 0.036 |
| 1325.0 | 0.037 |
| 1324.0 | 0.036 |
| 1323.0 | 0.036 |
| 1322.0 | 0.035 |
| 1321.0 | 0.035 |
| 1320.0 | 0.037 |
| 1319.0 | 0.034 |
| 1318.0 | 0.033 |
| 1317.0 | 0.034 |
| 1316.0 | 0.036 |
| 1315.0 | 0.031 |
| 1314.0 | 0.033 |
| 1313.0 | 0.028 |
| 1312.0 | 0.03 |
| 1311.0 | 0.032 |
| 1310.0 | 0.031 |
| 1309.0 | 0.033 |
| 1308.0 | 0.031 |
| 1307.0 | 0.03 |
| 1306.0 | 0.029 |
| 1305.0 | 0.032 |
| 1304.0 | 0.03 |
| 1303.0 | 0.029 |
| 1302.0 | 0.03 |
| 1301.0 | 0.031 |
| 1300.0 | 0.029 |
| 1299.0 | 0.027 |
| 1298.0 | 0.03 |
| 1297.0 | 0.029 |
| 1296.0 | 0.027 |
| 1295.0 | 0.028 |
| 1294.0 | 0.029 |
| 1293.0 | 0.029 |
| 1292.0 | 0.029 |
| 1291.0 | 0.029 |
| 1290.0 | 0.029 |
| 1289.0 | 0.027 |
| 1288.0 | 0.027 |
| 1287.0 | 0.028 |
| 1286.0 | 0.028 |
| 1285.0 | 0.028 |
| 1284.0 | 0.026 |
| 1283.0 | 0.028 |
| 1282.0 | 0.025 |
| 1281.0 | 0.028 |
| 1280.0 | 0.026 |
| 1279.0 | 0.026 |
| 1278.0 | 0.026 |
| 1277.0 | 0.025 |
| 1276.0 | 0.027 |
| 1275.0 | 0.027 |
| 1274.0 | 0.025 |
| 1273.0 | 0.024 |
| 1272.0 | 0.024 |
| 1271.0 | 0.024 |
| 1270.0 | 0.024 |
| 1269.0 | 0.023 |
| 1268.0 | 0.022 |
| 1267.0 | 0.026 |
| 1266.0 | 0.024 |
| 1265.0 | 0.025 |
| 1264.0 | 0.024 |
| 1263.0 | 0.027 |
| 1262.0 | 0.022 |
| 1261.0 | 0.024 |
| 1260.0 | 0.023 |
| 1259.0 | 0.023 |
| 1258.0 | 0.023 |
| 1257.0 | 0.022 |
| 1256.0 | 0.022 |
| 1255.0 | 0.024 |
| 1254.0 | 0.023 |
| 1253.0 | 0.022 |
| 1252.0 | 0.021 |
| 1251.0 | 0.023 |
| 1250.0 | 0.02 |
| 1249.0 | 0.022 |
| 1248.0 | 0.024 |
| 1247.0 | 0.022 |
| 1246.0 | 0.022 |
| 1245.0 | 0.021 |
| 1244.0 | 0.02 |
| 1243.0 | 0.021 |
| 1242.0 | 0.022 |
| 1241.0 | 0.022 |
| 1240.0 | 0.02 |
| 1239.0 | 0.022 |
| 1238.0 | 0.023 |
| 1237.0 | 0.019 |
| 1236.0 | 0.022 |
| 1235.0 | 0.022 |
| 1234.0 | 0.023 |
| 1233.0 | 0.02 |
| 1232.0 | 0.021 |
| 1231.0 | 0.021 |
| 1230.0 | 0.021 |
| 1229.0 | 0.022 |
| 1228.0 | 0.022 |
| 1227.0 | 0.024 |
| 1226.0 | 0.021 |
| 1225.0 | 0.021 |
| 1224.0 | 0.021 |
| 1223.0 | 0.019 |
| 1222.0 | 0.021 |
| 1221.0 | 0.023 |
| 1220.0 | 0.02 |
| 1219.0 | 0.019 |
| 1218.0 | 0.021 |
| 1217.0 | 0.02 |
| 1216.0 | 0.019 |
| 1215.0 | 0.022 |
| 1214.0 | 0.022 |
| 1213.0 | 0.022 |
| 1212.0 | 0.021 |
| 1211.0 | 0.022 |
| 1210.0 | 0.021 |
| 1209.0 | 0.018 |
| 1208.0 | 0.021 |
| 1207.0 | 0.021 |
| 1206.0 | 0.023 |
| 1205.0 | 0.022 |
| 1204.0 | 0.021 |
| 1203.0 | 0.023 |
| 1202.0 | 0.021 |
| 1201.0 | 0.021 |
| 1200.0 | 0.019 |
| 1199.0 | 0.026 |
| 1198.0 | 0.023 |
| 1197.0 | 0.023 |
| 1196.0 | 0.02 |
| 1195.0 | 0.019 |
| 1194.0 | 0.024 |
| 1193.0 | 0.024 |
| 1192.0 | 0.022 |
| 1191.0 | 0.021 |
| 1190.0 | 0.023 |
| 1189.0 | 0.021 |
| 1188.0 | 0.019 |
| 1187.0 | 0.021 |
| 1186.0 | 0.019 |
| 1185.0 | 0.02 |
| 1184.0 | 0.021 |
| 1183.0 | 0.022 |
| 1182.0 | 0.018 |
| 1181.0 | 0.024 |
| 1180.0 | 0.022 |
| 1179.0 | 0.02 |
| 1178.0 | 0.018 |
| 1177.0 | 0.02 |
| 1176.0 | 0.02 |
| 1175.0 | 0.019 |
| 1174.0 | 0.02 |
| 1173.0 | 0.021 |
| 1172.0 | 0.022 |
| 1171.0 | 0.02 |
| 1170.0 | 0.018 |
| 1169.0 | 0.018 |
| 1168.0 | 0.021 |
| 1167.0 | 0.021 |
| 1166.0 | 0.02 |
| 1165.0 | 0.022 |
| 1164.0 | 0.021 |
| 1163.0 | 0.021 |
| 1162.0 | 0.019 |
| 1161.0 | 0.023 |
| 1160.0 | 0.021 |
| 1159.0 | 0.021 |
| 1158.0 | 0.021 |
| 1157.0 | 0.022 |
| 1156.0 | 0.02 |
| 1155.0 | 0.023 |
| 1154.0 | 0.021 |
| 1153.0 | 0.023 |
| 1152.0 | 0.02 |
| 1151.0 | 0.02 |
| 1150.0 | 0.02 |
| 1149.0 | 0.019 |
| 1148.0 | 0.019 |
| 1147.0 | 0.021 |
| 1146.0 | 0.02 |
| 1145.0 | 0.022 |
| 1144.0 | 0.019 |
| 1143.0 | 0.022 |
| 1142.0 | 0.023 |
| 1141.0 | 0.023 |
| 1140.0 | 0.019 |
| 1139.0 | 0.021 |
| 1138.0 | 0.02 |
| 1137.0 | 0.021 |
| 1136.0 | 0.021 |
| 1135.0 | 0.02 |
| 1134.0 | 0.022 |
| 1133.0 | 0.021 |
| 1132.0 | 0.018 |
| 1131.0 | 0.022 |
| 1130.0 | 0.02 |
| 1129.0 | 0.021 |
| 1128.0 | 0.023 |
| 1127.0 | 0.021 |
| 1126.0 | 0.018 |
| 1125.0 | 0.022 |
| 1124.0 | 0.019 |
| 1123.0 | 0.021 |
| 1122.0 | 0.022 |
| 1121.0 | 0.018 |
| 1120.0 | 0.021 |
| 1119.0 | 0.022 |
| 1118.0 | 0.02 |
| 1117.0 | 0.024 |
| 1116.0 | 0.021 |
| 1115.0 | 0.02 |
| 1114.0 | 0.022 |
| 1113.0 | 0.02 |
| 1112.0 | 0.021 |
| 1111.0 | 0.021 |
| 1110.0 | 0.022 |
| 1109.0 | 0.02 |
| 1108.0 | 0.02 |
| 1107.0 | 0.02 |
| 1106.0 | 0.018 |
| 1105.0 | 0.021 |
| 1104.0 | 0.021 |
| 1103.0 | 0.021 |
| 1102.0 | 0.02 |
| 1101.0 | 0.02 |
| 1100.0 | 0.02 |
| 1099.0 | 0.022 |
| 1098.0 | 0.019 |
| 1097.0 | 0.019 |
| 1096.0 | 0.021 |
| 1095.0 | 0.022 |
| 1094.0 | 0.02 |
| 1093.0 | 0.02 |
| 1092.0 | 0.022 |
| 1091.0 | 0.02 |
| 1090.0 | 0.019 |
| 1089.0 | 0.02 |
| 1088.0 | 0.019 |
| 1087.0 | 0.018 |
| 1086.0 | 0.021 |
| 1085.0 | 0.02 |
| 1084.0 | 0.022 |
| 1083.0 | 0.02 |
| 1082.0 | 0.022 |
| 1081.0 | 0.022 |
| 1080.0 | 0.023 |
| 1079.0 | 0.018 |
| 1078.0 | 0.017 |
| 1077.0 | 0.023 |
| 1076.0 | 0.018 |
| 1075.0 | 0.02 |
| 1074.0 | 0.02 |
| 1073.0 | 0.018 |
| 1072.0 | 0.02 |
| 1071.0 | 0.02 |
| 1070.0 | 0.021 |
| 1069.0 | 0.02 |
| 1068.0 | 0.019 |
| 1067.0 | 0.02 |
| 1066.0 | 0.018 |
| 1065.0 | 0.018 |
| 1064.0 | 0.018 |
| 1063.0 | 0.019 |
| 1062.0 | 0.019 |
| 1061.0 | 0.017 |
| 1060.0 | 0.018 |
| 1059.0 | 0.023 |
| 1058.0 | 0.018 |
| 1057.0 | 0.02 |
| 1056.0 | 0.024 |
| 1055.0 | 0.021 |
| 1054.0 | 0.023 |
| 1053.0 | 0.019 |
| 1052.0 | 0.017 |
| 1051.0 | 0.023 |
| 1050.0 | 0.02 |
| 1049.0 | 0.021 |
| 1048.0 | 0.02 |
| 1047.0 | 0.021 |
| 1046.0 | 0.022 |
| 1045.0 | 0.02 |
| 1044.0 | 0.021 |
| 1043.0 | 0.021 |
| 1042.0 | 0.02 |
| 1041.0 | 0.02 |
| 1040.0 | 0.022 |
| 1039.0 | 0.02 |
| 1038.0 | 0.021 |
| 1037.0 | 0.023 |
| 1036.0 | 0.019 |
| 1035.0 | 0.021 |
| 1034.0 | 0.02 |
| 1033.0 | 0.021 |
| 1032.0 | 0.023 |
| 1031.0 | 0.022 |
| 1030.0 | 0.022 |
| 1029.0 | 0.023 |
| 1028.0 | 0.021 |
| 1027.0 | 0.021 |
| 1026.0 | 0.022 |
| 1025.0 | 0.022 |
| 1024.0 | 0.021 |
| 1023.0 | 0.024 |
| 1022.0 | 0.02 |
| 1021.0 | 0.021 |
| 1020.0 | 0.022 |
| 1019.0 | 0.02 |
| 1018.0 | 0.019 |
| 1017.0 | 0.02 |
| 1016.0 | 0.02 |
| 1015.0 | 0.019 |
| 1014.0 | 0.022 |
| 1013.0 | 0.019 |
| 1012.0 | 0.022 |
| 1011.0 | 0.022 |
| 1010.0 | 0.022 |
| 1009.0 | 0.022 |
| 1008.0 | 0.021 |
| 1007.0 | 0.021 |
| 1006.0 | 0.021 |
| 1005.0 | 0.019 |
| 1004.0 | 0.021 |
| 1003.0 | 0.018 |
| 1002.0 | 0.02 |
| 1001.0 | 0.021 |
| 1000.0 | 0.019 |
| 999.0 | 0.023 |
| 998.0 | 0.022 |
| 997.0 | 0.019 |
| 996.0 | 0.02 |
| 995.0 | 0.02 |
| 994.0 | 0.021 |
| 993.0 | 0.02 |
| 992.0 | 0.02 |
| 991.0 | 0.021 |
| 990.0 | 0.018 |
| 989.0 | 0.024 |
| 988.0 | 0.02 |
| 987.0 | 0.021 |
| 986.0 | 0.019 |
| 985.0 | 0.02 |
| 984.0 | 0.02 |
| 983.0 | 0.021 |
| 982.0 | 0.022 |
| 981.0 | 0.02 |
| 980.0 | 0.021 |
| 979.0 | 0.021 |
| 978.0 | 0.02 |
| 977.0 | 0.02 |
| 976.0 | 0.021 |
| 975.0 | 0.02 |
| 974.0 | 0.019 |
| 973.0 | 0.016 |
| 972.0 | 0.021 |
| 971.0 | 0.019 |
| 970.0 | 0.017 |
| 969.0 | 0.02 |
| 968.0 | 0.019 |
| 967.0 | 0.018 |
| 966.0 | 0.021 |
| 965.0 | 0.018 |
| 964.0 | 0.019 |
| 963.0 | 0.02 |
| 962.0 | 0.02 |
| 961.0 | 0.022 |
| 960.0 | 0.023 |
| 959.0 | 0.023 |
| 958.0 | 0.02 |
| 957.0 | 0.021 |
| 956.0 | 0.022 |
| 955.0 | 0.02 |
| 954.0 | 0.021 |
| 953.0 | 0.02 |
| 952.0 | 0.019 |
| 951.0 | 0.017 |
| 950.0 | 0.021 |
| 949.0 | 0.023 |
| 948.0 | 0.02 |
| 947.0 | 0.019 |
| 946.0 | 0.02 |
| 945.0 | 0.018 |
| 944.0 | 0.02 |
| 943.0 | 0.018 |
| 942.0 | 0.019 |
| 941.0 | 0.022 |
| 940.0 | 0.023 |
| 939.0 | 0.021 |
| 938.0 | 0.021 |
| 937.0 | 0.019 |
| 936.0 | 0.02 |
| 935.0 | 0.019 |
| 934.0 | 0.021 |
| 933.0 | 0.019 |
| 932.0 | 0.019 |
| 931.0 | 0.017 |
| 930.0 | 0.023 |
| 929.0 | 0.019 |
| 928.0 | 0.021 |
| 927.0 | 0.02 |
| 926.0 | 0.02 |
| 925.0 | 0.022 |
| 924.0 | 0.02 |
| 923.0 | 0.018 |
| 922.0 | 0.02 |
| 921.0 | 0.023 |
| 920.0 | 0.019 |
| 919.0 | 0.023 |
| 918.0 | 0.021 |
| 917.0 | 0.022 |
| 916.0 | 0.019 |
| 915.0 | 0.019 |
| 914.0 | 0.022 |
| 913.0 | 0.021 |
| 912.0 | 0.022 |
| 911.0 | 0.022 |
| 910.0 | 0.02 |
| 909.0 | 0.021 |
| 908.0 | 0.021 |
| 907.0 | 0.02 |
| 906.0 | 0.021 |
| 905.0 | 0.02 |
| 904.0 | 0.02 |
| 903.0 | 0.022 |
| 902.0 | 0.02 |
| 901.0 | 0.021 |
| 900.0 | 0.02 |
| 899.0 | 0.019 |
| 898.0 | 0.02 |
| 897.0 | 0.023 |
| 896.0 | 0.021 |
| 895.0 | 0.02 |
| 894.0 | 0.02 |
| 893.0 | 0.018 |
| 892.0 | 0.021 |
| 891.0 | 0.018 |
| 890.0 | 0.023 |
| 889.0 | 0.017 |
| 888.0 | 0.021 |
| 887.0 | 0.021 |
| 886.0 | 0.02 |
| 885.0 | 0.023 |
| 884.0 | 0.021 |
| 883.0 | 0.022 |
| 882.0 | 0.02 |
| 881.0 | 0.02 |
| 880.0 | 0.022 |
| 879.0 | 0.022 |
| 878.0 | 0.023 |
| 877.0 | 0.02 |
| 876.0 | 0.019 |
| 875.0 | 0.021 |
| 874.0 | 0.021 |
| 873.0 | 0.02 |
| 872.0 | 0.02 |
| 871.0 | 0.02 |
| 870.0 | 0.02 |
| 869.0 | 0.023 |
| 868.0 | 0.022 |
| 867.0 | 0.021 |
| 866.0 | 0.019 |
| 865.0 | 0.023 |
| 864.0 | 0.02 |
| 863.0 | 0.022 |
| 862.0 | 0.019 |
| 861.0 | 0.021 |
| 860.0 | 0.021 |
| 859.0 | 0.02 |
| 858.0 | 0.019 |
| 857.0 | 0.02 |
| 856.0 | 0.02 |
| 855.0 | 0.019 |
| 854.0 | 0.023 |
| 853.0 | 0.019 |
| 852.0 | 0.02 |
| 851.0 | 0.021 |
| 850.0 | 0.022 |
| 849.0 | 0.022 |
| 848.0 | 0.02 |
| 847.0 | 0.021 |
| 846.0 | 0.022 |
| 845.0 | 0.019 |
| 844.0 | 0.02 |
| 843.0 | 0.021 |
| 842.0 | 0.022 |
| 841.0 | 0.021 |
| 840.0 | 0.02 |
| 839.0 | 0.017 |
| 838.0 | 0.021 |
| 837.0 | 0.021 |
| 836.0 | 0.02 |
| 835.0 | 0.023 |
| 834.0 | 0.021 |
| 833.0 | 0.022 |
| 832.0 | 0.023 |
| 831.0 | 0.019 |
| 830.0 | 0.021 |
| 829.0 | 0.02 |
| 828.0 | 0.018 |
| 827.0 | 0.02 |
| 826.0 | 0.018 |
| 825.0 | 0.018 |
| 824.0 | 0.022 |
| 823.0 | 0.021 |
| 822.0 | 0.022 |
| 821.0 | 0.021 |
| 820.0 | 0.021 |
| 819.0 | 0.02 |
| 818.0 | 0.02 |
| 817.0 | 0.02 |
| 816.0 | 0.019 |
| 815.0 | 0.02 |
| 814.0 | 0.018 |
| 813.0 | 0.022 |
| 812.0 | 0.019 |
| 811.0 | 0.022 |
| 810.0 | 0.02 |
| 809.0 | 0.021 |
| 808.0 | 0.019 |
| 807.0 | 0.018 |
| 806.0 | 0.023 |
| 805.0 | 0.02 |
| 804.0 | 0.018 |
| 803.0 | 0.021 |
| 802.0 | 0.019 |
| 801.0 | 0.023 |
| 800.0 | 0.021 |
| 799.0 | 0 |
| 798.0 | 0 |
| 797.0 | 0 |
| 796.0 | 0 |
| 795.0 | 0 |
| 794.0 | 0 |
| 793.0 | 0 |
| 792.0 | 0 |
| 791.0 | 0 |
| 790.0 | 0 |
| 789.0 | 0 |
| 788.0 | 0 |
| 787.0 | 0 |
| 786.0 | 0 |
| 785.0 | 0 |
| 784.0 | 0 |
| 783.0 | 0 |
| 782.0 | 0 |
| 781.0 | 0 |
| 780.0 | 0 |
| 779.0 | 0 |
| 778.0 | 0 |
| 777.0 | 0 |
| 776.0 | 0 |
| 775.0 | 0 |
| 774.0 | 0 |
| 773.0 | 0 |
| 772.0 | 0 |
| 771.0 | 0 |
| 770.0 | 0 |
| 769.0 | 0 |
| 768.0 | 0 |
| 767.0 | 0 |
| 766.0 | 0 |
| 765.0 | 0 |
| 764.0 | 0 |
| 763.0 | 0 |
| 762.0 | 0 |
| 761.0 | 0 |
| 760.0 | 0 |
| 759.0 | 0 |
| 758.0 | 0 |
| 757.0 | 0 |
| 756.0 | 0 |
| 755.0 | 0 |
| 754.0 | 0 |
| 753.0 | 0 |
| 752.0 | 0 |
| 751.0 | 0 |
| 750.0 | 0 |
| 749.0 | 0 |
| 748.0 | 0 |
| 747.0 | 0 |
| 746.0 | 0 |
| 745.0 | 0 |
| 744.0 | 0 |
| 743.0 | 0.001 |
| 742.0 | 0 |
| 741.0 | 0 |
| 740.0 | 0 |
| 739.0 | 0 |
| 738.0 | 0 |
| 737.0 | 0 |
| 736.0 | 0 |
| 735.0 | 0 |
| 734.0 | 0 |
| 733.0 | 0 |
| 732.0 | 0 |
| 731.0 | 0 |
| 730.0 | 0 |
| 729.0 | 0 |
| 728.0 | 0 |
| 727.0 | 0 |
| 726.0 | 0 |
| 725.0 | 0 |
| 724.0 | 0 |
| 723.0 | 0 |
| 722.0 | 0 |
| 721.0 | 0 |
| 720.0 | 0 |
| 719.0 | 0 |
| 718.0 | 0 |
| 717.0 | 0 |
| 716.0 | 0 |
| 715.0 | 0 |
| 714.0 | 0 |
| 713.0 | 0 |
| 712.0 | 0 |
| 711.0 | 0 |
| 710.0 | 0 |
| 709.0 | 0 |
| 708.0 | 0 |
| 707.0 | 0 |
| 706.0 | 0 |
| 705.0 | 0 |
| 704.0 | 0 |
| 703.0 | 0 |
| 702.0 | 0 |
| 701.0 | 0 |
| 700.0 | 0 |
| 699.0 | 0 |
| 698.0 | 0 |
| 697.0 | 0 |
| 696.0 | 0 |
| 695.0 | 0 |
| 694.0 | 0 |
| 693.0 | 0 |
| 692.0 | 0 |
| 691.0 | 0 |
| 690.0 | 0 |
| 689.0 | 0 |
| 688.0 | 0 |
| 687.0 | 0 |
| 686.0 | 0 |
| 685.0 | 0 |
| 684.0 | 0 |
| 683.0 | 0 |
| 682.0 | 0 |
| 681.0 | 0 |
| 680.0 | 0 |
| 679.0 | 0 |
| 678.0 | 0 |
| 677.0 | 0 |
| 676.0 | 0 |
| 675.0 | 0 |
| 674.0 | 0 |
| 673.0 | 0 |
| 672.0 | 0 |
| 671.0 | 0 |
| 670.0 | 0 |
| 669.0 | 0 |
| 668.0 | 0 |
| 667.0 | 0 |
| 666.0 | 0 |
| 665.0 | 0 |
| 664.0 | 0 |
| 663.0 | 0 |
| 662.0 | 0 |
| 661.0 | 0 |
| 660.0 | 0 |
| 659.0 | 0 |
| 658.0 | 0 |
| 657.0 | 0 |
| 656.0 | 0 |
| 655.0 | 0 |
| 654.0 | 0 |
| 653.0 | 0 |
| 652.0 | 0 |
| 651.0 | 0 |
| 650.0 | 0 |
| 649.0 | 0 |
| 648.0 | 0 |
| 647.0 | 0 |
| 646.0 | 0 |
| 645.0 | 0 |
| 644.0 | 0 |
| 643.0 | 0 |
| 642.0 | 0 |
| 641.0 | 0 |
| 640.0 | 0 |
| 639.0 | 0 |
| 638.0 | 0 |
| 637.0 | 0 |
| 636.0 | 0 |
| 635.0 | 0 |
| 634.0 | 0 |
| 633.0 | 0 |
| 632.0 | 0 |
| 631.0 | 0 |
| 630.0 | 0 |
| 629.0 | 0.001 |
| 628.0 | 0.001 |
| 627.0 | 0.001 |
| 626.0 | 0.001 |
| 625.0 | 0.001 |
| 624.0 | 0.001 |
| 623.0 | 0.001 |
| 622.0 | 0.001 |
| 621.0 | 0 |
| 620.0 | 0 |
| 619.0 | 0 |
| 618.0 | 0 |
| 617.0 | 0 |
| 616.0 | 0 |
| 615.0 | 0 |
| 614.0 | 0 |
| 613.0 | 0 |
| 612.0 | 0 |
| 611.0 | 0 |
| 610.0 | 0 |
| 609.0 | 0 |
| 608.0 | 0 |
| 607.0 | 0 |
| 606.0 | 0 |
| 605.0 | 0 |
| 604.0 | 0 |
| 603.0 | 0 |
| 602.0 | 0 |
| 601.0 | 0 |
| 600.0 | 0 |
| 599.0 | 0 |
| 598.0 | 0 |
| 597.0 | 0 |
| 596.0 | 0 |
| 595.0 | 0 |
| 594.0 | 0 |
| 593.0 | 0 |
| 592.0 | 0 |
| 591.0 | 0 |
| 590.0 | 0 |
| 589.0 | 0 |
| 588.0 | 0 |
| 587.0 | 0 |
| 586.0 | 0 |
| 585.0 | 0 |
| 584.0 | 0 |
| 583.0 | 0 |
| 582.0 | 0 |
| 581.0 | 0 |
| 580.0 | 0 |
| 579.0 | 0 |
| 578.0 | 0 |
| 577.0 | 0 |
| 576.0 | 0 |
| 575.0 | 0 |
| 574.0 | 0 |
| 573.0 | 0 |
| 572.0 | 0 |
| 571.0 | 0 |
| 570.0 | 0.001 |
| 569.0 | 0 |
| 568.0 | 0.001 |
| 567.0 | 0.001 |
| 566.0 | 0.001 |
| 565.0 | 0.001 |
| 564.0 | 0.001 |
| 563.0 | 0.001 |
| 562.0 | 0.001 |
| 561.0 | 0.001 |
| 560.0 | 0.001 |
| 559.0 | 0.001 |
| 558.0 | 0.001 |
| 557.0 | 0.001 |
| 556.0 | 0.001 |
| 555.0 | 0.001 |
| 554.0 | 0.001 |
| 553.0 | 0.001 |
| 552.0 | 0.001 |
| 551.0 | 0.001 |
| 550.0 | 0.001 |
| 549.0 | 0.001 |
| 548.0 | 0.001 |
| 547.0 | 0.001 |
| 546.0 | 0.001 |
| 545.0 | 0.001 |
| 544.0 | 0.001 |
| 543.0 | 0.001 |
| 542.0 | 0.001 |
| 541.0 | 0.001 |
| 540.0 | 0.001 |
| 539.0 | 0.001 |
| 538.0 | 0.001 |
| 537.0 | 0.001 |
| 536.0 | 0.001 |
| 535.0 | 0.001 |
| 534.0 | 0.001 |
| 533.0 | 0.001 |
| 532.0 | 0.001 |
| 531.0 | 0.001 |
| 530.0 | 0.001 |
| 529.0 | 0.002 |
| 528.0 | 0.001 |
| 527.0 | 0.001 |
| 526.0 | 0.002 |
| 525.0 | 0.002 |
| 524.0 | 0.002 |
| 523.0 | 0.003 |
| 522.0 | 0.004 |
| 521.0 | 0.006 |
| 520.0 | 0.011 |
| 519.0 | 0.025 |
| 518.0 | 0.076 |
| 517.0 | 0.46 |
| 516.0 | 5.487 |
| 515.0 | 20.034 |
| 514.0 | 28.588 |
| 513.0 | 17.323 |
| 512.0 | 3.911 |
| 511.0 | 0.356 |
| 510.0 | 0.059 |
| 509.0 | 0.019 |
| 508.0 | 0.009 |
| 507.0 | 0.005 |
| 506.0 | 0.003 |
| 505.0 | 0.002 |
| 504.0 | 0.002 |
| 503.0 | 0.001 |
| 502.0 | 0.001 |
| 501.0 | 0.001 |
| 500.0 | 0.001 |
| 499.0 | 0.001 |
| 498.0 | 0.001 |
| 497.0 | 0.001 |
| 496.0 | 0.001 |
| 495.0 | 0.001 |
| 494.0 | 0.001 |
| 493.0 | 0.001 |
| 492.0 | 0.001 |
| 491.0 | 0.001 |
| 490.0 | 0.001 |
| 489.0 | 0.001 |
| 488.0 | 0.001 |
| 487.0 | 0.001 |
| 486.0 | 0.001 |
| 485.0 | 0.001 |
| 484.0 | 0.001 |
| 483.0 | 0.001 |
| 482.0 | 0.001 |
| 481.0 | 0.001 |
| 480.0 | 0.001 |
| 479.0 | 0.001 |
| 478.0 | 0.001 |
| 477.0 | 0.001 |
| 476.0 | 0.001 |
| 475.0 | 0.001 |
| 474.0 | 0.001 |
| 473.0 | 0.001 |
| 472.0 | 0.001 |
| 471.0 | 0.001 |
| 470.0 | 0.001 |
| 469.0 | 0 |
| 468.0 | 0 |
| 467.0 | 0 |
| 466.0 | 0 |
| 465.0 | 0 |
| 464.0 | 0 |
| 463.0 | 0 |
| 462.0 | 0 |
| 461.0 | 0 |
| 460.0 | 0 |
| 459.0 | 0 |
| 458.0 | 0 |
| 457.0 | 0 |
| 456.0 | 0 |
| 455.0 | 0 |
| 454.0 | 0 |
| 453.0 | 0 |
| 452.0 | 0 |
| 451.0 | 0 |
| 450.0 | 0 |
| 449.0 | 0 |
| 448.0 | 0 |
| 447.0 | 0 |
| 446.0 | 0 |
| 445.0 | 0 |
| 444.0 | 0 |
| 443.0 | 0 |
| 442.0 | 0 |
| 441.0 | 0 |
| 440.0 | 0 |
| 439.0 | 0 |
| 438.0 | 0 |
| 437.0 | 0.001 |
| 436.0 | 0.001 |
| 435.0 | 0.001 |
| 434.0 | 0 |
| 433.0 | 0 |
| 432.0 | 0 |
| 431.0 | 0 |
| 430.0 | 0 |
| 429.0 | 0 |
| 428.0 | 0 |
| 427.0 | 0 |
| 426.0 | 0 |
| 425.0 | 0 |
| 424.0 | 0 |
| 423.0 | 0 |
| 422.0 | 0 |
| 421.0 | 0 |
| 420.0 | 0 |
| 419.0 | 0 |
| 418.0 | 0 |
| 417.0 | 0 |
| 416.0 | 0 |
| 415.0 | 0 |
| 414.0 | 0 |
| 413.0 | 0 |
| 412.0 | 0 |
| 411.0 | 0 |
| 410.0 | 0 |
| 409.0 | 0 |
| 408.0 | 0 |
| 407.0 | 0 |
| 406.0 | 0 |
| 405.0 | 0 |
| 404.0 | 0 |
| 403.0 | 0 |
| 402.0 | 0 |
| 401.0 | 0 |
| 400.0 | 0 |
| 399.0 | 0 |
| 398.0 | 0 |
| 397.0 | 0 |
| 396.0 | 0 |
| 395.0 | 0 |
| 394.0 | 0 |
| 393.0 | 0 |
| 392.0 | 0 |
| 391.0 | 0 |
| 390.0 | 0 |
| 389.0 | 0 |
| 388.0 | 0 |
| 387.0 | 0 |
| 386.0 | 0 |
| 385.0 | 0.001 |
| 384.0 | 0.001 |
| 383.0 | 0.001 |
| 382.0 | 0.002 |
| 381.0 | 0.004 |
| 380.0 | 0.007 |
| 379.0 | 0.011 |
| 378.0 | 0.014 |
| 377.0 | 0.016 |
| 376.0 | 0.019 |
| 375.0 | 0.022 |
| 374.0 | 0.024 |
| 373.0 | 0.025 |
| 372.0 | 0.023 |
| 371.0 | 0.021 |
| 370.0 | 0.018 |
| 369.0 | 0.015 |
| 368.0 | 0.012 |
| 367.0 | 0.01 |
| 366.0 | 0.008 |
| 365.0 | 0.006 |
| 364.0 | 0.005 |
| 363.0 | 0.003 |
| 362.0 | 0.002 |
| 361.0 | 0.001 |
| 360.0 | 0.001 |
| 359.0 | 0 |
| 358.0 | 0 |
| 357.0 | 0 |
| 356.0 | 0 |
| 355.0 | 0 |
| 354.0 | 0 |
| 353.0 | 0 |
| 352.0 | 0 |
| 351.0 | 0 |
| 350.0 | 0 |
| 349.0 | 0.001 |
| 348.0 | 0 |
| 347.0 | 0 |
| 346.0 | 0 |
| 345.0 | 0 |
| 344.0 | 0 |
| 343.0 | 0 |
| 342.0 | 0 |
| 341.0 | 0 |
| 340.0 | 0 |
| 339.0 | 0 |
| 338.0 | 0 |
| 337.0 | 0 |
| 336.0 | 0 |
| 335.0 | 0 |
| 334.0 | 0 |
| 333.0 | 0 |
| 332.0 | 0 |
| 331.0 | 0 |
| 330.0 | 0 |
| 329.0 | 0 |
| 328.0 | 0 |
| 327.0 | 0 |
| 326.0 | 0 |
| 325.0 | 0 |
| 324.0 | 0 |
| 323.0 | 0 |
| 322.0 | 0 |
| 321.0 | 0 |
| 320.0 | 0 |
| 319.0 | 0 |
| 318.0 | 0 |
| 317.0 | 0 |
| 316.0 | 0 |
| 315.0 | 0 |
| 314.0 | 0 |
| 313.0 | 0 |
| 312.0 | 0 |
| 311.0 | 0 |
| 310.0 | 0 |
| 309.0 | 0 |
| 308.0 | 0 |
| 307.0 | 0 |
| 306.0 | 0 |
| 305.0 | 0 |
| 304.0 | 0 |
| 303.0 | 0 |
| 302.0 | 0 |
| 301.0 | 0 |
| 300.0 | 0 |
| 299.0 | 0 |
| 298.0 | 0 |
| 297.0 | 0 |
| 296.0 | 0 |
| 295.0 | 0 |
| 294.0 | 0 |
| 293.0 | 0 |
| 292.0 | 0 |
| 291.0 | 0 |
| 290.0 | 0 |
| 289.0 | 0 |
| 288.0 | 0 |
| 287.0 | 0 |
| 286.0 | 0 |
| 285.0 | 0 |
| 284.0 | 0 |
| 283.0 | 0 |
| 282.0 | 0 |
| 281.0 | 0 |
| 280.0 | 0 |
| 279.0 | 0 |
| 278.0 | 0 |
| 277.0 | 0 |
| 276.0 | 0 |
| 275.0 | 0 |
| 274.0 | 0 |
| 273.0 | 0 |
| 272.0 | 0 |
| 271.0 | 0 |
| 270.0 | 0 |
| 269.0 | 0 |
| 268.0 | 0 |
| 267.0 | 0 |
| 266.0 | 0 |
| 265.0 | 0 |
| 264.0 | 0 |
| 263.0 | 0 |
| 262.0 | 0 |
| 261.0 | 0 |
| 260.0 | 0 |
| 259.0 | 0 |
| 258.0 | 0 |
| 257.0 | 0 |
| 256.0 | 0 |
| 255.0 | 0 |
| 254.0 | 0 |
| 253.0 | 0 |
| 252.0 | 0 |
| 251.0 | 0 |
| 250.0 | 0 |
| 249.0 | 0 |
| 248.0 | 0 |
| 247.0 | 0 |
| 246.0 | 0 |
| 245.0 | 0 |
| 244.0 | 0 |
| 243.0 | 0 |
| 242.0 | 0 |
| 241.0 | 0 |
| 240.0 | 0 |
| 239.0 | 0 |
| 238.0 | 0 |
| 237.0 | 0 |
| 236.0 | 0 |
| 235.0 | 0 |
| 234.0 | 0 |
| 233.0 | 0 |
| 232.0 | 0 |
| 231.0 | 0 |
| 230.0 | 0 |
| 229.0 | 0 |
| 228.0 | 0 |
| 227.0 | 0 |
| 226.0 | 0 |
| 225.0 | 0 |
| 224.0 | 0 |
| 223.0 | 0 |
| 222.0 | 0 |
| 221.0 | 0 |
| 220.0 | 0 |
| 219.0 | 0 |
| 218.0 | 0 |
| 217.0 | 0 |
| 216.0 | 0 |
| 215.0 | 0 |
| 214.0 | 0 |
| 213.0 | 0 |
| 212.0 | 0 |
| 211.0 | 0 |
| 210.0 | 0 |
| 209.0 | 0 |
| 208.0 | 0 |
| 207.0 | 0 |
| 206.0 | 0 |
| 205.0 | 0 |
| 204.0 | 0 |
| 203.0 | 0 |
| 202.0 | 0 |
| 201.0 | 0 |